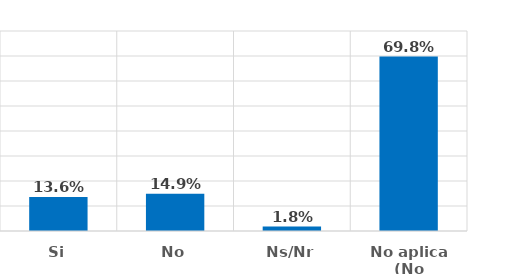
| Category | Series 0 |
|---|---|
| Si | 0.136 |
| No | 0.149 |
| Ns/Nr | 0.018 |
| No aplica (No reconoce los artistas) | 0.698 |